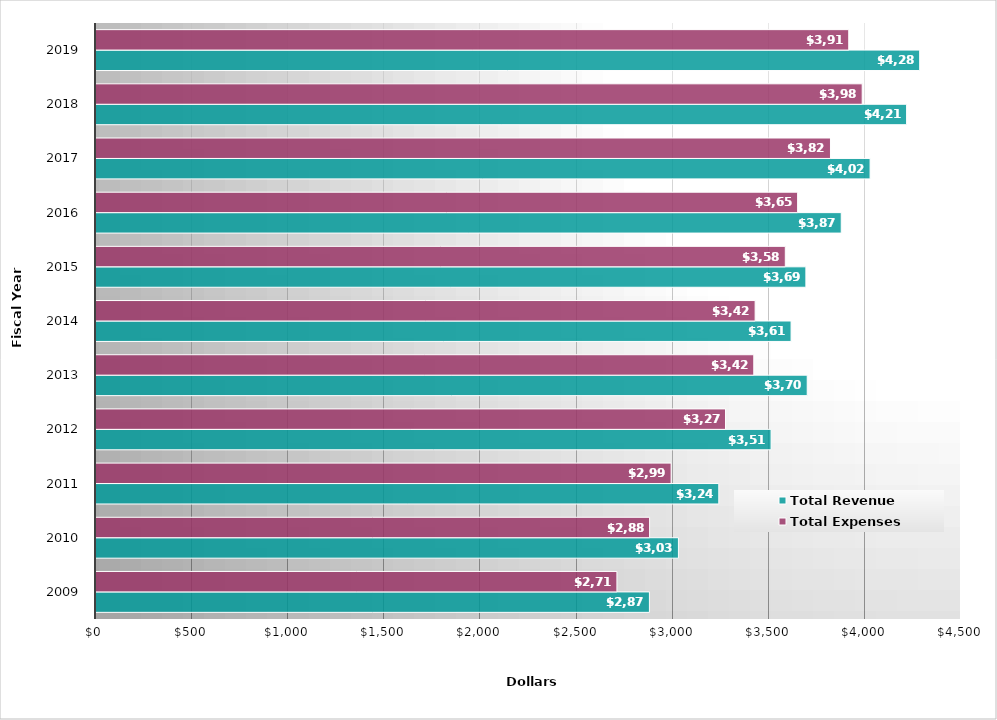
| Category | Total Revenue | Total Expenses |
|---|---|---|
| 2009.0 | 2879 | 2710 |
| 2010.0 | 3030 | 2880 |
| 2011.0 | 3240 | 2992 |
| 2012.0 | 3512 | 3275 |
| 2013.0 | 3700 | 3422 |
| 2014.0 | 3616 | 3429 |
| 2015.0 | 3693 | 3586 |
| 2016.0 | 3877 | 3650 |
| 2017.0 | 4027 | 3821 |
| 2018.0 | 4217 | 3986 |
| 2019.0 | 4285 | 3916 |